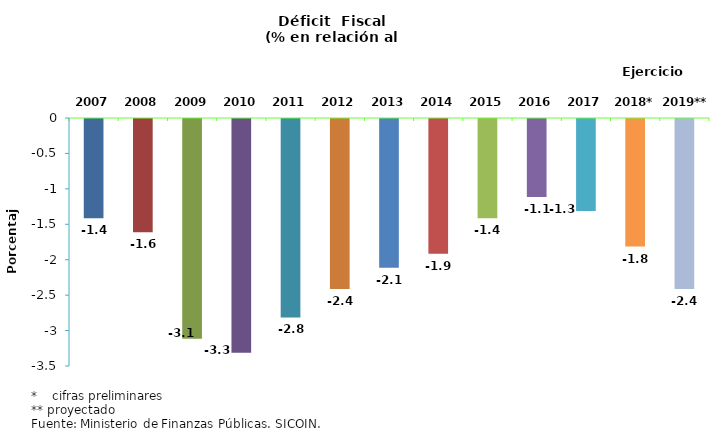
| Category | Series 0 |
|---|---|
| 2007 | -1.4 |
| 2008 | -1.6 |
| 2009 | -3.1 |
| 2010 | -3.3 |
| 2011 | -2.8 |
| 2012 | -2.4 |
| 2013 | -2.1 |
| 2014 | -1.9 |
| 2015 | -1.4 |
| 2016 | -1.1 |
| 2017 | -1.3 |
| 2018* | -1.8 |
| 2019** | -2.4 |